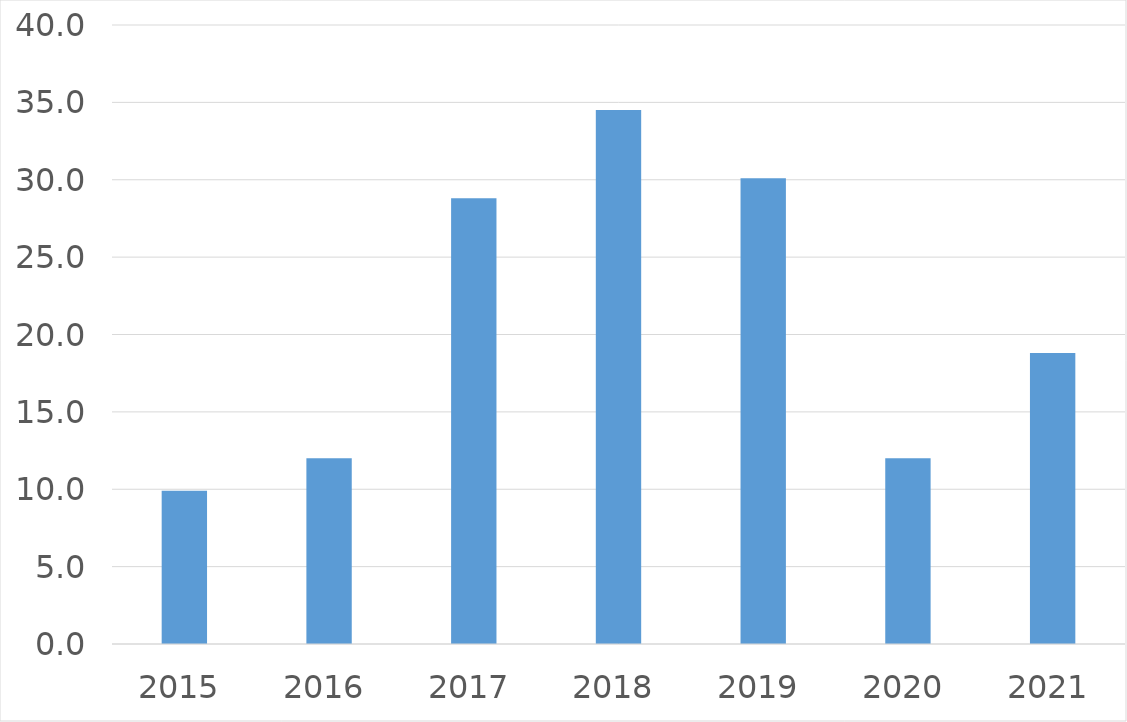
| Category | Series 0 |
|---|---|
| 2015 | 9.9 |
| 2016 | 12 |
| 2017 | 28.8 |
| 2018 | 34.5 |
| 2019 | 30.1 |
| 2020 | 12 |
| 2021 | 18.8 |